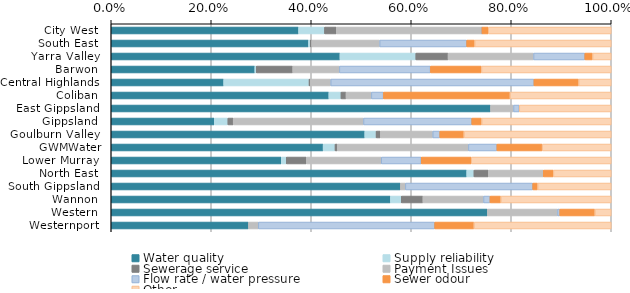
| Category | Water quality | Supply reliability | Sewerage service | Payment Issues | Flow rate / water pressure | Sewer odour | Other |
|---|---|---|---|---|---|---|---|
| City West  | 0.375 | 0.052 | 0.024 | 0.291 | 0.001 | 0.013 | 0.246 |
| South East  | 0.395 | 0.003 | 0.003 | 0.136 | 0.174 | 0.016 | 0.273 |
| Yarra Valley  | 0.457 | 0.152 | 0.065 | 0.171 | 0.103 | 0.016 | 0.037 |
| Barwon  | 0.287 | 0.003 | 0.073 | 0.093 | 0.182 | 0.102 | 0.259 |
| Central Highlands  | 0.225 | 0.171 | 0.003 | 0.041 | 0.407 | 0.089 | 0.065 |
| Coliban  | 0.435 | 0.024 | 0.01 | 0.051 | 0.024 | 0.253 | 0.202 |
| East Gippsland  | 0.759 | 0 | 0 | 0.046 | 0.011 | 0 | 0.184 |
| Gippsland  | 0.206 | 0.027 | 0.011 | 0.261 | 0.217 | 0.02 | 0.259 |
| Goulburn Valley  | 0.507 | 0.023 | 0.008 | 0.105 | 0.014 | 0.048 | 0.295 |
| GWMWater | 0.424 | 0.024 | 0.005 | 0.262 | 0.057 | 0.09 | 0.138 |
| Lower Murray  | 0.34 | 0.01 | 0.04 | 0.15 | 0.08 | 0.1 | 0.28 |
| North East  | 0.711 | 0.014 | 0.029 | 0.11 | 0 | 0.02 | 0.116 |
| South Gippsland  | 0.578 | 0 | 0 | 0.01 | 0.255 | 0.01 | 0.147 |
| Wannon  | 0.558 | 0.022 | 0.043 | 0.121 | 0.013 | 0.022 | 0.221 |
| Western  | 0.752 | 0 | 0 | 0.14 | 0.005 | 0.07 | 0.033 |
| Westernport  | 0.275 | 0 | 0 | 0.02 | 0.353 | 0.078 | 0.275 |